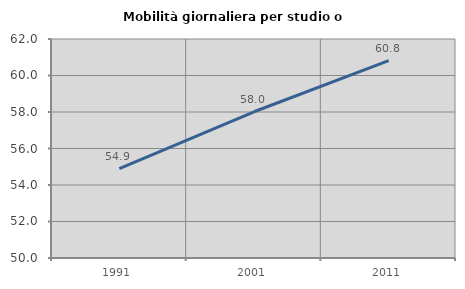
| Category | Mobilità giornaliera per studio o lavoro |
|---|---|
| 1991.0 | 54.891 |
| 2001.0 | 58.013 |
| 2011.0 | 60.811 |